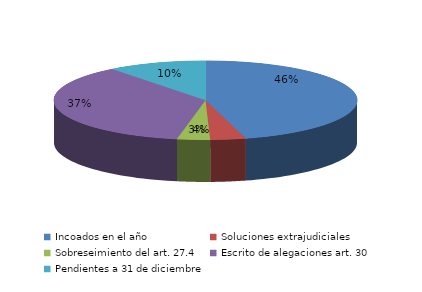
| Category | Series 0 |
|---|---|
| Incoados en el año | 327 |
| Soluciones extrajudiciales | 27 |
| Sobreseimiento del art. 27.4 | 25 |
| Escrito de alegaciones art. 30 | 261 |
| Pendientes a 31 de diciembre | 75 |